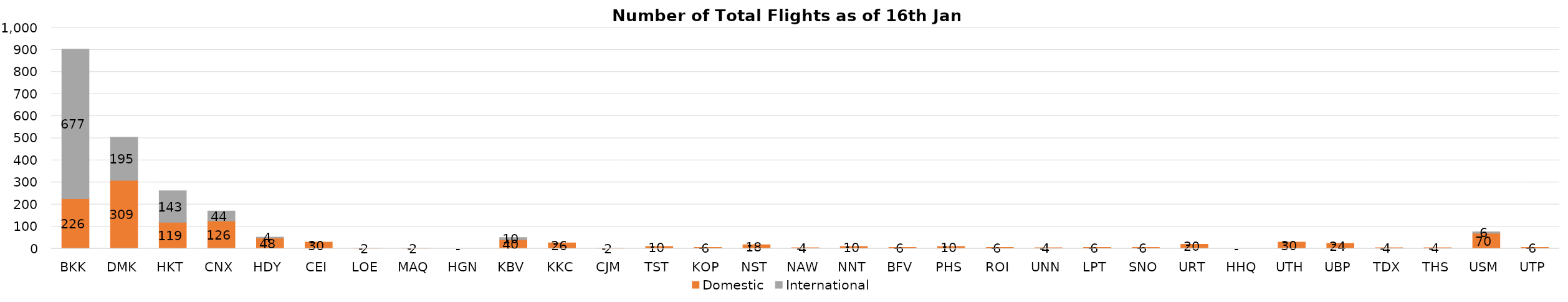
| Category | Domestic | International |
|---|---|---|
| BKK | 226 | 677 |
| DMK | 309 | 195 |
| HKT | 119 | 143 |
| CNX | 126 | 44 |
| HDY | 48 | 4 |
| CEI | 30 | 0 |
| LOE | 2 | 0 |
| MAQ | 2 | 0 |
| HGN | 0 | 0 |
| KBV | 40 | 10 |
| KKC | 26 | 0 |
| CJM | 2 | 0 |
| TST | 10 | 0 |
| KOP | 6 | 0 |
| NST | 18 | 0 |
| NAW | 4 | 0 |
| NNT | 10 | 0 |
| BFV | 6 | 0 |
| PHS | 10 | 0 |
| ROI | 6 | 0 |
| UNN | 4 | 0 |
| LPT | 6 | 0 |
| SNO | 6 | 0 |
| URT | 20 | 0 |
| HHQ | 0 | 0 |
| UTH | 30 | 0 |
| UBP | 24 | 0 |
| TDX | 4 | 0 |
| THS | 4 | 0 |
| USM | 70 | 6 |
| UTP | 6 | 0 |